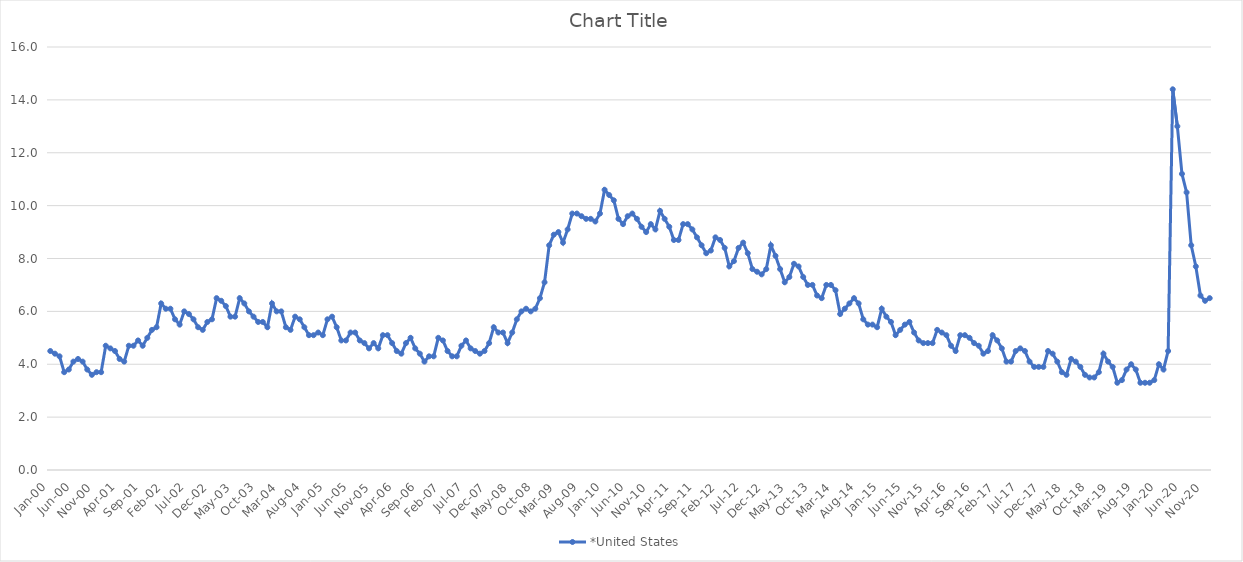
| Category | *United States | Alaska | Alabama | Arkansas | Arizona | California | Colorado | Connecticut | Delaware | Florida | Georgia | Hawaii | Iowa | Idaho | Illinois | Indiana | Kansas | Kentucky | Louisiana | Massachusetts | Maryland | Maine | Michigan | Minnesota | Missouri | Mississippi | Montana | North Carolina | North Dakota | Nebraska | New Hampshire | New Jersey | New Mexico | Nevada | New York | Ohio | Oklahoma | Oregon | Pennsylvania | Rhode Island | South Carolina | South Dakota | Tennessee | Texas | Utah | Virginia | Vermont | Washington | Wisconsin | West Virginia | Wyoming |
|---|---|---|---|---|---|---|---|---|---|---|---|---|---|---|---|---|---|---|---|---|---|---|---|---|---|---|---|---|---|---|---|---|---|---|---|---|---|---|---|---|---|---|---|---|---|---|---|---|---|---|---|
| Jan-00 | 4.5 |  |  |  |  |  |  |  |  |  |  |  |  |  |  |  |  |  |  |  |  |  |  |  |  |  |  |  |  |  |  |  |  |  |  |  |  |  |  |  |  |  |  |  |  |  |  |  |  |  |  |
| Feb-00 | 4.4 |  |  |  |  |  |  |  |  |  |  |  |  |  |  |  |  |  |  |  |  |  |  |  |  |  |  |  |  |  |  |  |  |  |  |  |  |  |  |  |  |  |  |  |  |  |  |  |  |  |  |
| Mar-00 | 4.3 |  |  |  |  |  |  |  |  |  |  |  |  |  |  |  |  |  |  |  |  |  |  |  |  |  |  |  |  |  |  |  |  |  |  |  |  |  |  |  |  |  |  |  |  |  |  |  |  |  |  |
| Apr-00 | 3.7 |  |  |  |  |  |  |  |  |  |  |  |  |  |  |  |  |  |  |  |  |  |  |  |  |  |  |  |  |  |  |  |  |  |  |  |  |  |  |  |  |  |  |  |  |  |  |  |  |  |  |
| May-00 | 3.8 |  |  |  |  |  |  |  |  |  |  |  |  |  |  |  |  |  |  |  |  |  |  |  |  |  |  |  |  |  |  |  |  |  |  |  |  |  |  |  |  |  |  |  |  |  |  |  |  |  |  |
| Jun-00 | 4.1 |  |  |  |  |  |  |  |  |  |  |  |  |  |  |  |  |  |  |  |  |  |  |  |  |  |  |  |  |  |  |  |  |  |  |  |  |  |  |  |  |  |  |  |  |  |  |  |  |  |  |
| Jul-00 | 4.2 |  |  |  |  |  |  |  |  |  |  |  |  |  |  |  |  |  |  |  |  |  |  |  |  |  |  |  |  |  |  |  |  |  |  |  |  |  |  |  |  |  |  |  |  |  |  |  |  |  |  |
| Aug-00 | 4.1 |  |  |  |  |  |  |  |  |  |  |  |  |  |  |  |  |  |  |  |  |  |  |  |  |  |  |  |  |  |  |  |  |  |  |  |  |  |  |  |  |  |  |  |  |  |  |  |  |  |  |
| Sep-00 | 3.8 |  |  |  |  |  |  |  |  |  |  |  |  |  |  |  |  |  |  |  |  |  |  |  |  |  |  |  |  |  |  |  |  |  |  |  |  |  |  |  |  |  |  |  |  |  |  |  |  |  |  |
| Oct-00 | 3.6 |  |  |  |  |  |  |  |  |  |  |  |  |  |  |  |  |  |  |  |  |  |  |  |  |  |  |  |  |  |  |  |  |  |  |  |  |  |  |  |  |  |  |  |  |  |  |  |  |  |  |
| Nov-00 | 3.7 |  |  |  |  |  |  |  |  |  |  |  |  |  |  |  |  |  |  |  |  |  |  |  |  |  |  |  |  |  |  |  |  |  |  |  |  |  |  |  |  |  |  |  |  |  |  |  |  |  |  |
| Dec-00 | 3.7 |  |  |  |  |  |  |  |  |  |  |  |  |  |  |  |  |  |  |  |  |  |  |  |  |  |  |  |  |  |  |  |  |  |  |  |  |  |  |  |  |  |  |  |  |  |  |  |  |  |  |
| Jan-01 | 4.7 |  |  |  |  |  |  |  |  |  |  |  |  |  |  |  |  |  |  |  |  |  |  |  |  |  |  |  |  |  |  |  |  |  |  |  |  |  |  |  |  |  |  |  |  |  |  |  |  |  |  |
| Feb-01 | 4.6 |  |  |  |  |  |  |  |  |  |  |  |  |  |  |  |  |  |  |  |  |  |  |  |  |  |  |  |  |  |  |  |  |  |  |  |  |  |  |  |  |  |  |  |  |  |  |  |  |  |  |
| Mar-01 | 4.5 |  |  |  |  |  |  |  |  |  |  |  |  |  |  |  |  |  |  |  |  |  |  |  |  |  |  |  |  |  |  |  |  |  |  |  |  |  |  |  |  |  |  |  |  |  |  |  |  |  |  |
| Apr-01 | 4.2 |  |  |  |  |  |  |  |  |  |  |  |  |  |  |  |  |  |  |  |  |  |  |  |  |  |  |  |  |  |  |  |  |  |  |  |  |  |  |  |  |  |  |  |  |  |  |  |  |  |  |
| May-01 | 4.1 |  |  |  |  |  |  |  |  |  |  |  |  |  |  |  |  |  |  |  |  |  |  |  |  |  |  |  |  |  |  |  |  |  |  |  |  |  |  |  |  |  |  |  |  |  |  |  |  |  |  |
| Jun-01 | 4.7 |  |  |  |  |  |  |  |  |  |  |  |  |  |  |  |  |  |  |  |  |  |  |  |  |  |  |  |  |  |  |  |  |  |  |  |  |  |  |  |  |  |  |  |  |  |  |  |  |  |  |
| Jul-01 | 4.7 |  |  |  |  |  |  |  |  |  |  |  |  |  |  |  |  |  |  |  |  |  |  |  |  |  |  |  |  |  |  |  |  |  |  |  |  |  |  |  |  |  |  |  |  |  |  |  |  |  |  |
| Aug-01 | 4.9 |  |  |  |  |  |  |  |  |  |  |  |  |  |  |  |  |  |  |  |  |  |  |  |  |  |  |  |  |  |  |  |  |  |  |  |  |  |  |  |  |  |  |  |  |  |  |  |  |  |  |
| Sep-01 | 4.7 |  |  |  |  |  |  |  |  |  |  |  |  |  |  |  |  |  |  |  |  |  |  |  |  |  |  |  |  |  |  |  |  |  |  |  |  |  |  |  |  |  |  |  |  |  |  |  |  |  |  |
| Oct-01 | 5 |  |  |  |  |  |  |  |  |  |  |  |  |  |  |  |  |  |  |  |  |  |  |  |  |  |  |  |  |  |  |  |  |  |  |  |  |  |  |  |  |  |  |  |  |  |  |  |  |  |  |
| Nov-01 | 5.3 |  |  |  |  |  |  |  |  |  |  |  |  |  |  |  |  |  |  |  |  |  |  |  |  |  |  |  |  |  |  |  |  |  |  |  |  |  |  |  |  |  |  |  |  |  |  |  |  |  |  |
| Dec-01 | 5.4 |  |  |  |  |  |  |  |  |  |  |  |  |  |  |  |  |  |  |  |  |  |  |  |  |  |  |  |  |  |  |  |  |  |  |  |  |  |  |  |  |  |  |  |  |  |  |  |  |  |  |
| Jan-02 | 6.3 |  |  |  |  |  |  |  |  |  |  |  |  |  |  |  |  |  |  |  |  |  |  |  |  |  |  |  |  |  |  |  |  |  |  |  |  |  |  |  |  |  |  |  |  |  |  |  |  |  |  |
| Feb-02 | 6.1 |  |  |  |  |  |  |  |  |  |  |  |  |  |  |  |  |  |  |  |  |  |  |  |  |  |  |  |  |  |  |  |  |  |  |  |  |  |  |  |  |  |  |  |  |  |  |  |  |  |  |
| Mar-02 | 6.1 |  |  |  |  |  |  |  |  |  |  |  |  |  |  |  |  |  |  |  |  |  |  |  |  |  |  |  |  |  |  |  |  |  |  |  |  |  |  |  |  |  |  |  |  |  |  |  |  |  |  |
| Apr-02 | 5.7 |  |  |  |  |  |  |  |  |  |  |  |  |  |  |  |  |  |  |  |  |  |  |  |  |  |  |  |  |  |  |  |  |  |  |  |  |  |  |  |  |  |  |  |  |  |  |  |  |  |  |
| May-02 | 5.5 |  |  |  |  |  |  |  |  |  |  |  |  |  |  |  |  |  |  |  |  |  |  |  |  |  |  |  |  |  |  |  |  |  |  |  |  |  |  |  |  |  |  |  |  |  |  |  |  |  |  |
| Jun-02 | 6 |  |  |  |  |  |  |  |  |  |  |  |  |  |  |  |  |  |  |  |  |  |  |  |  |  |  |  |  |  |  |  |  |  |  |  |  |  |  |  |  |  |  |  |  |  |  |  |  |  |  |
| Jul-02 | 5.9 |  |  |  |  |  |  |  |  |  |  |  |  |  |  |  |  |  |  |  |  |  |  |  |  |  |  |  |  |  |  |  |  |  |  |  |  |  |  |  |  |  |  |  |  |  |  |  |  |  |  |
| Aug-02 | 5.7 |  |  |  |  |  |  |  |  |  |  |  |  |  |  |  |  |  |  |  |  |  |  |  |  |  |  |  |  |  |  |  |  |  |  |  |  |  |  |  |  |  |  |  |  |  |  |  |  |  |  |
| Sep-02 | 5.4 |  |  |  |  |  |  |  |  |  |  |  |  |  |  |  |  |  |  |  |  |  |  |  |  |  |  |  |  |  |  |  |  |  |  |  |  |  |  |  |  |  |  |  |  |  |  |  |  |  |  |
| Oct-02 | 5.3 |  |  |  |  |  |  |  |  |  |  |  |  |  |  |  |  |  |  |  |  |  |  |  |  |  |  |  |  |  |  |  |  |  |  |  |  |  |  |  |  |  |  |  |  |  |  |  |  |  |  |
| Nov-02 | 5.6 |  |  |  |  |  |  |  |  |  |  |  |  |  |  |  |  |  |  |  |  |  |  |  |  |  |  |  |  |  |  |  |  |  |  |  |  |  |  |  |  |  |  |  |  |  |  |  |  |  |  |
| Dec-02 | 5.7 |  |  |  |  |  |  |  |  |  |  |  |  |  |  |  |  |  |  |  |  |  |  |  |  |  |  |  |  |  |  |  |  |  |  |  |  |  |  |  |  |  |  |  |  |  |  |  |  |  |  |
| Jan-03 | 6.5 |  |  |  |  |  |  |  |  |  |  |  |  |  |  |  |  |  |  |  |  |  |  |  |  |  |  |  |  |  |  |  |  |  |  |  |  |  |  |  |  |  |  |  |  |  |  |  |  |  |  |
| Feb-03 | 6.4 |  |  |  |  |  |  |  |  |  |  |  |  |  |  |  |  |  |  |  |  |  |  |  |  |  |  |  |  |  |  |  |  |  |  |  |  |  |  |  |  |  |  |  |  |  |  |  |  |  |  |
| Mar-03 | 6.2 |  |  |  |  |  |  |  |  |  |  |  |  |  |  |  |  |  |  |  |  |  |  |  |  |  |  |  |  |  |  |  |  |  |  |  |  |  |  |  |  |  |  |  |  |  |  |  |  |  |  |
| Apr-03 | 5.8 |  |  |  |  |  |  |  |  |  |  |  |  |  |  |  |  |  |  |  |  |  |  |  |  |  |  |  |  |  |  |  |  |  |  |  |  |  |  |  |  |  |  |  |  |  |  |  |  |  |  |
| May-03 | 5.8 |  |  |  |  |  |  |  |  |  |  |  |  |  |  |  |  |  |  |  |  |  |  |  |  |  |  |  |  |  |  |  |  |  |  |  |  |  |  |  |  |  |  |  |  |  |  |  |  |  |  |
| Jun-03 | 6.5 |  |  |  |  |  |  |  |  |  |  |  |  |  |  |  |  |  |  |  |  |  |  |  |  |  |  |  |  |  |  |  |  |  |  |  |  |  |  |  |  |  |  |  |  |  |  |  |  |  |  |
| Jul-03 | 6.3 |  |  |  |  |  |  |  |  |  |  |  |  |  |  |  |  |  |  |  |  |  |  |  |  |  |  |  |  |  |  |  |  |  |  |  |  |  |  |  |  |  |  |  |  |  |  |  |  |  |  |
| Aug-03 | 6 |  |  |  |  |  |  |  |  |  |  |  |  |  |  |  |  |  |  |  |  |  |  |  |  |  |  |  |  |  |  |  |  |  |  |  |  |  |  |  |  |  |  |  |  |  |  |  |  |  |  |
| Sep-03 | 5.8 |  |  |  |  |  |  |  |  |  |  |  |  |  |  |  |  |  |  |  |  |  |  |  |  |  |  |  |  |  |  |  |  |  |  |  |  |  |  |  |  |  |  |  |  |  |  |  |  |  |  |
| Oct-03 | 5.6 |  |  |  |  |  |  |  |  |  |  |  |  |  |  |  |  |  |  |  |  |  |  |  |  |  |  |  |  |  |  |  |  |  |  |  |  |  |  |  |  |  |  |  |  |  |  |  |  |  |  |
| Nov-03 | 5.6 |  |  |  |  |  |  |  |  |  |  |  |  |  |  |  |  |  |  |  |  |  |  |  |  |  |  |  |  |  |  |  |  |  |  |  |  |  |  |  |  |  |  |  |  |  |  |  |  |  |  |
| Dec-03 | 5.4 |  |  |  |  |  |  |  |  |  |  |  |  |  |  |  |  |  |  |  |  |  |  |  |  |  |  |  |  |  |  |  |  |  |  |  |  |  |  |  |  |  |  |  |  |  |  |  |  |  |  |
| Jan-04 | 6.3 |  |  |  |  |  |  |  |  |  |  |  |  |  |  |  |  |  |  |  |  |  |  |  |  |  |  |  |  |  |  |  |  |  |  |  |  |  |  |  |  |  |  |  |  |  |  |  |  |  |  |
| Feb-04 | 6 |  |  |  |  |  |  |  |  |  |  |  |  |  |  |  |  |  |  |  |  |  |  |  |  |  |  |  |  |  |  |  |  |  |  |  |  |  |  |  |  |  |  |  |  |  |  |  |  |  |  |
| Mar-04 | 6 |  |  |  |  |  |  |  |  |  |  |  |  |  |  |  |  |  |  |  |  |  |  |  |  |  |  |  |  |  |  |  |  |  |  |  |  |  |  |  |  |  |  |  |  |  |  |  |  |  |  |
| Apr-04 | 5.4 |  |  |  |  |  |  |  |  |  |  |  |  |  |  |  |  |  |  |  |  |  |  |  |  |  |  |  |  |  |  |  |  |  |  |  |  |  |  |  |  |  |  |  |  |  |  |  |  |  |  |
| May-04 | 5.3 |  |  |  |  |  |  |  |  |  |  |  |  |  |  |  |  |  |  |  |  |  |  |  |  |  |  |  |  |  |  |  |  |  |  |  |  |  |  |  |  |  |  |  |  |  |  |  |  |  |  |
| Jun-04 | 5.8 |  |  |  |  |  |  |  |  |  |  |  |  |  |  |  |  |  |  |  |  |  |  |  |  |  |  |  |  |  |  |  |  |  |  |  |  |  |  |  |  |  |  |  |  |  |  |  |  |  |  |
| Jul-04 | 5.7 |  |  |  |  |  |  |  |  |  |  |  |  |  |  |  |  |  |  |  |  |  |  |  |  |  |  |  |  |  |  |  |  |  |  |  |  |  |  |  |  |  |  |  |  |  |  |  |  |  |  |
| Aug-04 | 5.4 |  |  |  |  |  |  |  |  |  |  |  |  |  |  |  |  |  |  |  |  |  |  |  |  |  |  |  |  |  |  |  |  |  |  |  |  |  |  |  |  |  |  |  |  |  |  |  |  |  |  |
| Sep-04 | 5.1 |  |  |  |  |  |  |  |  |  |  |  |  |  |  |  |  |  |  |  |  |  |  |  |  |  |  |  |  |  |  |  |  |  |  |  |  |  |  |  |  |  |  |  |  |  |  |  |  |  |  |
| Oct-04 | 5.1 |  |  |  |  |  |  |  |  |  |  |  |  |  |  |  |  |  |  |  |  |  |  |  |  |  |  |  |  |  |  |  |  |  |  |  |  |  |  |  |  |  |  |  |  |  |  |  |  |  |  |
| Nov-04 | 5.2 |  |  |  |  |  |  |  |  |  |  |  |  |  |  |  |  |  |  |  |  |  |  |  |  |  |  |  |  |  |  |  |  |  |  |  |  |  |  |  |  |  |  |  |  |  |  |  |  |  |  |
| Dec-04 | 5.1 |  |  |  |  |  |  |  |  |  |  |  |  |  |  |  |  |  |  |  |  |  |  |  |  |  |  |  |  |  |  |  |  |  |  |  |  |  |  |  |  |  |  |  |  |  |  |  |  |  |  |
| Jan-05 | 5.7 |  |  |  |  |  |  |  |  |  |  |  |  |  |  |  |  |  |  |  |  |  |  |  |  |  |  |  |  |  |  |  |  |  |  |  |  |  |  |  |  |  |  |  |  |  |  |  |  |  |  |
| Feb-05 | 5.8 |  |  |  |  |  |  |  |  |  |  |  |  |  |  |  |  |  |  |  |  |  |  |  |  |  |  |  |  |  |  |  |  |  |  |  |  |  |  |  |  |  |  |  |  |  |  |  |  |  |  |
| Mar-05 | 5.4 |  |  |  |  |  |  |  |  |  |  |  |  |  |  |  |  |  |  |  |  |  |  |  |  |  |  |  |  |  |  |  |  |  |  |  |  |  |  |  |  |  |  |  |  |  |  |  |  |  |  |
| Apr-05 | 4.9 |  |  |  |  |  |  |  |  |  |  |  |  |  |  |  |  |  |  |  |  |  |  |  |  |  |  |  |  |  |  |  |  |  |  |  |  |  |  |  |  |  |  |  |  |  |  |  |  |  |  |
| May-05 | 4.9 |  |  |  |  |  |  |  |  |  |  |  |  |  |  |  |  |  |  |  |  |  |  |  |  |  |  |  |  |  |  |  |  |  |  |  |  |  |  |  |  |  |  |  |  |  |  |  |  |  |  |
| Jun-05 | 5.2 |  |  |  |  |  |  |  |  |  |  |  |  |  |  |  |  |  |  |  |  |  |  |  |  |  |  |  |  |  |  |  |  |  |  |  |  |  |  |  |  |  |  |  |  |  |  |  |  |  |  |
| Jul-05 | 5.2 |  |  |  |  |  |  |  |  |  |  |  |  |  |  |  |  |  |  |  |  |  |  |  |  |  |  |  |  |  |  |  |  |  |  |  |  |  |  |  |  |  |  |  |  |  |  |  |  |  |  |
| Aug-05 | 4.9 |  |  |  |  |  |  |  |  |  |  |  |  |  |  |  |  |  |  |  |  |  |  |  |  |  |  |  |  |  |  |  |  |  |  |  |  |  |  |  |  |  |  |  |  |  |  |  |  |  |  |
| Sep-05 | 4.8 |  |  |  |  |  |  |  |  |  |  |  |  |  |  |  |  |  |  |  |  |  |  |  |  |  |  |  |  |  |  |  |  |  |  |  |  |  |  |  |  |  |  |  |  |  |  |  |  |  |  |
| Oct-05 | 4.6 |  |  |  |  |  |  |  |  |  |  |  |  |  |  |  |  |  |  |  |  |  |  |  |  |  |  |  |  |  |  |  |  |  |  |  |  |  |  |  |  |  |  |  |  |  |  |  |  |  |  |
| Nov-05 | 4.8 |  |  |  |  |  |  |  |  |  |  |  |  |  |  |  |  |  |  |  |  |  |  |  |  |  |  |  |  |  |  |  |  |  |  |  |  |  |  |  |  |  |  |  |  |  |  |  |  |  |  |
| Dec-05 | 4.6 |  |  |  |  |  |  |  |  |  |  |  |  |  |  |  |  |  |  |  |  |  |  |  |  |  |  |  |  |  |  |  |  |  |  |  |  |  |  |  |  |  |  |  |  |  |  |  |  |  |  |
| Jan-06 | 5.1 |  |  |  |  |  |  |  |  |  |  |  |  |  |  |  |  |  |  |  |  |  |  |  |  |  |  |  |  |  |  |  |  |  |  |  |  |  |  |  |  |  |  |  |  |  |  |  |  |  |  |
| Feb-06 | 5.1 |  |  |  |  |  |  |  |  |  |  |  |  |  |  |  |  |  |  |  |  |  |  |  |  |  |  |  |  |  |  |  |  |  |  |  |  |  |  |  |  |  |  |  |  |  |  |  |  |  |  |
| Mar-06 | 4.8 |  |  |  |  |  |  |  |  |  |  |  |  |  |  |  |  |  |  |  |  |  |  |  |  |  |  |  |  |  |  |  |  |  |  |  |  |  |  |  |  |  |  |  |  |  |  |  |  |  |  |
| Apr-06 | 4.5 |  |  |  |  |  |  |  |  |  |  |  |  |  |  |  |  |  |  |  |  |  |  |  |  |  |  |  |  |  |  |  |  |  |  |  |  |  |  |  |  |  |  |  |  |  |  |  |  |  |  |
| May-06 | 4.4 |  |  |  |  |  |  |  |  |  |  |  |  |  |  |  |  |  |  |  |  |  |  |  |  |  |  |  |  |  |  |  |  |  |  |  |  |  |  |  |  |  |  |  |  |  |  |  |  |  |  |
| Jun-06 | 4.8 |  |  |  |  |  |  |  |  |  |  |  |  |  |  |  |  |  |  |  |  |  |  |  |  |  |  |  |  |  |  |  |  |  |  |  |  |  |  |  |  |  |  |  |  |  |  |  |  |  |  |
| Jul-06 | 5 |  |  |  |  |  |  |  |  |  |  |  |  |  |  |  |  |  |  |  |  |  |  |  |  |  |  |  |  |  |  |  |  |  |  |  |  |  |  |  |  |  |  |  |  |  |  |  |  |  |  |
| Aug-06 | 4.6 |  |  |  |  |  |  |  |  |  |  |  |  |  |  |  |  |  |  |  |  |  |  |  |  |  |  |  |  |  |  |  |  |  |  |  |  |  |  |  |  |  |  |  |  |  |  |  |  |  |  |
| Sep-06 | 4.4 |  |  |  |  |  |  |  |  |  |  |  |  |  |  |  |  |  |  |  |  |  |  |  |  |  |  |  |  |  |  |  |  |  |  |  |  |  |  |  |  |  |  |  |  |  |  |  |  |  |  |
| Oct-06 | 4.1 |  |  |  |  |  |  |  |  |  |  |  |  |  |  |  |  |  |  |  |  |  |  |  |  |  |  |  |  |  |  |  |  |  |  |  |  |  |  |  |  |  |  |  |  |  |  |  |  |  |  |
| Nov-06 | 4.3 |  |  |  |  |  |  |  |  |  |  |  |  |  |  |  |  |  |  |  |  |  |  |  |  |  |  |  |  |  |  |  |  |  |  |  |  |  |  |  |  |  |  |  |  |  |  |  |  |  |  |
| Dec-06 | 4.3 |  |  |  |  |  |  |  |  |  |  |  |  |  |  |  |  |  |  |  |  |  |  |  |  |  |  |  |  |  |  |  |  |  |  |  |  |  |  |  |  |  |  |  |  |  |  |  |  |  |  |
| Jan-07 | 5 |  |  |  |  |  |  |  |  |  |  |  |  |  |  |  |  |  |  |  |  |  |  |  |  |  |  |  |  |  |  |  |  |  |  |  |  |  |  |  |  |  |  |  |  |  |  |  |  |  |  |
| Feb-07 | 4.9 |  |  |  |  |  |  |  |  |  |  |  |  |  |  |  |  |  |  |  |  |  |  |  |  |  |  |  |  |  |  |  |  |  |  |  |  |  |  |  |  |  |  |  |  |  |  |  |  |  |  |
| Mar-07 | 4.5 |  |  |  |  |  |  |  |  |  |  |  |  |  |  |  |  |  |  |  |  |  |  |  |  |  |  |  |  |  |  |  |  |  |  |  |  |  |  |  |  |  |  |  |  |  |  |  |  |  |  |
| Apr-07 | 4.3 |  |  |  |  |  |  |  |  |  |  |  |  |  |  |  |  |  |  |  |  |  |  |  |  |  |  |  |  |  |  |  |  |  |  |  |  |  |  |  |  |  |  |  |  |  |  |  |  |  |  |
| May-07 | 4.3 |  |  |  |  |  |  |  |  |  |  |  |  |  |  |  |  |  |  |  |  |  |  |  |  |  |  |  |  |  |  |  |  |  |  |  |  |  |  |  |  |  |  |  |  |  |  |  |  |  |  |
| Jun-07 | 4.7 |  |  |  |  |  |  |  |  |  |  |  |  |  |  |  |  |  |  |  |  |  |  |  |  |  |  |  |  |  |  |  |  |  |  |  |  |  |  |  |  |  |  |  |  |  |  |  |  |  |  |
| Jul-07 | 4.9 |  |  |  |  |  |  |  |  |  |  |  |  |  |  |  |  |  |  |  |  |  |  |  |  |  |  |  |  |  |  |  |  |  |  |  |  |  |  |  |  |  |  |  |  |  |  |  |  |  |  |
| Aug-07 | 4.6 |  |  |  |  |  |  |  |  |  |  |  |  |  |  |  |  |  |  |  |  |  |  |  |  |  |  |  |  |  |  |  |  |  |  |  |  |  |  |  |  |  |  |  |  |  |  |  |  |  |  |
| Sep-07 | 4.5 |  |  |  |  |  |  |  |  |  |  |  |  |  |  |  |  |  |  |  |  |  |  |  |  |  |  |  |  |  |  |  |  |  |  |  |  |  |  |  |  |  |  |  |  |  |  |  |  |  |  |
| Oct-07 | 4.4 |  |  |  |  |  |  |  |  |  |  |  |  |  |  |  |  |  |  |  |  |  |  |  |  |  |  |  |  |  |  |  |  |  |  |  |  |  |  |  |  |  |  |  |  |  |  |  |  |  |  |
| Nov-07 | 4.5 |  |  |  |  |  |  |  |  |  |  |  |  |  |  |  |  |  |  |  |  |  |  |  |  |  |  |  |  |  |  |  |  |  |  |  |  |  |  |  |  |  |  |  |  |  |  |  |  |  |  |
| Dec-07 | 4.8 |  |  |  |  |  |  |  |  |  |  |  |  |  |  |  |  |  |  |  |  |  |  |  |  |  |  |  |  |  |  |  |  |  |  |  |  |  |  |  |  |  |  |  |  |  |  |  |  |  |  |
| Jan-08 | 5.4 |  |  |  |  |  |  |  |  |  |  |  |  |  |  |  |  |  |  |  |  |  |  |  |  |  |  |  |  |  |  |  |  |  |  |  |  |  |  |  |  |  |  |  |  |  |  |  |  |  |  |
| Feb-08 | 5.2 |  |  |  |  |  |  |  |  |  |  |  |  |  |  |  |  |  |  |  |  |  |  |  |  |  |  |  |  |  |  |  |  |  |  |  |  |  |  |  |  |  |  |  |  |  |  |  |  |  |  |
| Mar-08 | 5.2 |  |  |  |  |  |  |  |  |  |  |  |  |  |  |  |  |  |  |  |  |  |  |  |  |  |  |  |  |  |  |  |  |  |  |  |  |  |  |  |  |  |  |  |  |  |  |  |  |  |  |
| Apr-08 | 4.8 |  |  |  |  |  |  |  |  |  |  |  |  |  |  |  |  |  |  |  |  |  |  |  |  |  |  |  |  |  |  |  |  |  |  |  |  |  |  |  |  |  |  |  |  |  |  |  |  |  |  |
| May-08 | 5.2 |  |  |  |  |  |  |  |  |  |  |  |  |  |  |  |  |  |  |  |  |  |  |  |  |  |  |  |  |  |  |  |  |  |  |  |  |  |  |  |  |  |  |  |  |  |  |  |  |  |  |
| Jun-08 | 5.7 |  |  |  |  |  |  |  |  |  |  |  |  |  |  |  |  |  |  |  |  |  |  |  |  |  |  |  |  |  |  |  |  |  |  |  |  |  |  |  |  |  |  |  |  |  |  |  |  |  |  |
| Jul-08 | 6 |  |  |  |  |  |  |  |  |  |  |  |  |  |  |  |  |  |  |  |  |  |  |  |  |  |  |  |  |  |  |  |  |  |  |  |  |  |  |  |  |  |  |  |  |  |  |  |  |  |  |
| Aug-08 | 6.1 |  |  |  |  |  |  |  |  |  |  |  |  |  |  |  |  |  |  |  |  |  |  |  |  |  |  |  |  |  |  |  |  |  |  |  |  |  |  |  |  |  |  |  |  |  |  |  |  |  |  |
| Sep-08 | 6 |  |  |  |  |  |  |  |  |  |  |  |  |  |  |  |  |  |  |  |  |  |  |  |  |  |  |  |  |  |  |  |  |  |  |  |  |  |  |  |  |  |  |  |  |  |  |  |  |  |  |
| Oct-08 | 6.1 |  |  |  |  |  |  |  |  |  |  |  |  |  |  |  |  |  |  |  |  |  |  |  |  |  |  |  |  |  |  |  |  |  |  |  |  |  |  |  |  |  |  |  |  |  |  |  |  |  |  |
| Nov-08 | 6.5 |  |  |  |  |  |  |  |  |  |  |  |  |  |  |  |  |  |  |  |  |  |  |  |  |  |  |  |  |  |  |  |  |  |  |  |  |  |  |  |  |  |  |  |  |  |  |  |  |  |  |
| Dec-08 | 7.1 |  |  |  |  |  |  |  |  |  |  |  |  |  |  |  |  |  |  |  |  |  |  |  |  |  |  |  |  |  |  |  |  |  |  |  |  |  |  |  |  |  |  |  |  |  |  |  |  |  |  |
| Jan-09 | 8.5 |  |  |  |  |  |  |  |  |  |  |  |  |  |  |  |  |  |  |  |  |  |  |  |  |  |  |  |  |  |  |  |  |  |  |  |  |  |  |  |  |  |  |  |  |  |  |  |  |  |  |
| Feb-09 | 8.9 |  |  |  |  |  |  |  |  |  |  |  |  |  |  |  |  |  |  |  |  |  |  |  |  |  |  |  |  |  |  |  |  |  |  |  |  |  |  |  |  |  |  |  |  |  |  |  |  |  |  |
| Mar-09 | 9 |  |  |  |  |  |  |  |  |  |  |  |  |  |  |  |  |  |  |  |  |  |  |  |  |  |  |  |  |  |  |  |  |  |  |  |  |  |  |  |  |  |  |  |  |  |  |  |  |  |  |
| Apr-09 | 8.6 |  |  |  |  |  |  |  |  |  |  |  |  |  |  |  |  |  |  |  |  |  |  |  |  |  |  |  |  |  |  |  |  |  |  |  |  |  |  |  |  |  |  |  |  |  |  |  |  |  |  |
| May-09 | 9.1 |  |  |  |  |  |  |  |  |  |  |  |  |  |  |  |  |  |  |  |  |  |  |  |  |  |  |  |  |  |  |  |  |  |  |  |  |  |  |  |  |  |  |  |  |  |  |  |  |  |  |
| Jun-09 | 9.7 |  |  |  |  |  |  |  |  |  |  |  |  |  |  |  |  |  |  |  |  |  |  |  |  |  |  |  |  |  |  |  |  |  |  |  |  |  |  |  |  |  |  |  |  |  |  |  |  |  |  |
| Jul-09 | 9.7 |  |  |  |  |  |  |  |  |  |  |  |  |  |  |  |  |  |  |  |  |  |  |  |  |  |  |  |  |  |  |  |  |  |  |  |  |  |  |  |  |  |  |  |  |  |  |  |  |  |  |
| Aug-09 | 9.6 |  |  |  |  |  |  |  |  |  |  |  |  |  |  |  |  |  |  |  |  |  |  |  |  |  |  |  |  |  |  |  |  |  |  |  |  |  |  |  |  |  |  |  |  |  |  |  |  |  |  |
| Sep-09 | 9.5 |  |  |  |  |  |  |  |  |  |  |  |  |  |  |  |  |  |  |  |  |  |  |  |  |  |  |  |  |  |  |  |  |  |  |  |  |  |  |  |  |  |  |  |  |  |  |  |  |  |  |
| Oct-09 | 9.5 |  |  |  |  |  |  |  |  |  |  |  |  |  |  |  |  |  |  |  |  |  |  |  |  |  |  |  |  |  |  |  |  |  |  |  |  |  |  |  |  |  |  |  |  |  |  |  |  |  |  |
| Nov-09 | 9.4 |  |  |  |  |  |  |  |  |  |  |  |  |  |  |  |  |  |  |  |  |  |  |  |  |  |  |  |  |  |  |  |  |  |  |  |  |  |  |  |  |  |  |  |  |  |  |  |  |  |  |
| Dec-09 | 9.7 |  |  |  |  |  |  |  |  |  |  |  |  |  |  |  |  |  |  |  |  |  |  |  |  |  |  |  |  |  |  |  |  |  |  |  |  |  |  |  |  |  |  |  |  |  |  |  |  |  |  |
| Jan-10 | 10.6 |  |  |  |  |  |  |  |  |  |  |  |  |  |  |  |  |  |  |  |  |  |  |  |  |  |  |  |  |  |  |  |  |  |  |  |  |  |  |  |  |  |  |  |  |  |  |  |  |  |  |
| Feb-10 | 10.4 |  |  |  |  |  |  |  |  |  |  |  |  |  |  |  |  |  |  |  |  |  |  |  |  |  |  |  |  |  |  |  |  |  |  |  |  |  |  |  |  |  |  |  |  |  |  |  |  |  |  |
| Mar-10 | 10.2 |  |  |  |  |  |  |  |  |  |  |  |  |  |  |  |  |  |  |  |  |  |  |  |  |  |  |  |  |  |  |  |  |  |  |  |  |  |  |  |  |  |  |  |  |  |  |  |  |  |  |
| Apr-10 | 9.5 |  |  |  |  |  |  |  |  |  |  |  |  |  |  |  |  |  |  |  |  |  |  |  |  |  |  |  |  |  |  |  |  |  |  |  |  |  |  |  |  |  |  |  |  |  |  |  |  |  |  |
| May-10 | 9.3 |  |  |  |  |  |  |  |  |  |  |  |  |  |  |  |  |  |  |  |  |  |  |  |  |  |  |  |  |  |  |  |  |  |  |  |  |  |  |  |  |  |  |  |  |  |  |  |  |  |  |
| Jun-10 | 9.6 |  |  |  |  |  |  |  |  |  |  |  |  |  |  |  |  |  |  |  |  |  |  |  |  |  |  |  |  |  |  |  |  |  |  |  |  |  |  |  |  |  |  |  |  |  |  |  |  |  |  |
| Jul-10 | 9.7 |  |  |  |  |  |  |  |  |  |  |  |  |  |  |  |  |  |  |  |  |  |  |  |  |  |  |  |  |  |  |  |  |  |  |  |  |  |  |  |  |  |  |  |  |  |  |  |  |  |  |
| Aug-10 | 9.5 |  |  |  |  |  |  |  |  |  |  |  |  |  |  |  |  |  |  |  |  |  |  |  |  |  |  |  |  |  |  |  |  |  |  |  |  |  |  |  |  |  |  |  |  |  |  |  |  |  |  |
| Sep-10 | 9.2 |  |  |  |  |  |  |  |  |  |  |  |  |  |  |  |  |  |  |  |  |  |  |  |  |  |  |  |  |  |  |  |  |  |  |  |  |  |  |  |  |  |  |  |  |  |  |  |  |  |  |
| Oct-10 | 9 |  |  |  |  |  |  |  |  |  |  |  |  |  |  |  |  |  |  |  |  |  |  |  |  |  |  |  |  |  |  |  |  |  |  |  |  |  |  |  |  |  |  |  |  |  |  |  |  |  |  |
| Nov-10 | 9.3 |  |  |  |  |  |  |  |  |  |  |  |  |  |  |  |  |  |  |  |  |  |  |  |  |  |  |  |  |  |  |  |  |  |  |  |  |  |  |  |  |  |  |  |  |  |  |  |  |  |  |
| Dec-10 | 9.1 |  |  |  |  |  |  |  |  |  |  |  |  |  |  |  |  |  |  |  |  |  |  |  |  |  |  |  |  |  |  |  |  |  |  |  |  |  |  |  |  |  |  |  |  |  |  |  |  |  |  |
| Jan-11 | 9.8 |  |  |  |  |  |  |  |  |  |  |  |  |  |  |  |  |  |  |  |  |  |  |  |  |  |  |  |  |  |  |  |  |  |  |  |  |  |  |  |  |  |  |  |  |  |  |  |  |  |  |
| Feb-11 | 9.5 |  |  |  |  |  |  |  |  |  |  |  |  |  |  |  |  |  |  |  |  |  |  |  |  |  |  |  |  |  |  |  |  |  |  |  |  |  |  |  |  |  |  |  |  |  |  |  |  |  |  |
| Mar-11 | 9.2 |  |  |  |  |  |  |  |  |  |  |  |  |  |  |  |  |  |  |  |  |  |  |  |  |  |  |  |  |  |  |  |  |  |  |  |  |  |  |  |  |  |  |  |  |  |  |  |  |  |  |
| Apr-11 | 8.7 |  |  |  |  |  |  |  |  |  |  |  |  |  |  |  |  |  |  |  |  |  |  |  |  |  |  |  |  |  |  |  |  |  |  |  |  |  |  |  |  |  |  |  |  |  |  |  |  |  |  |
| May-11 | 8.7 |  |  |  |  |  |  |  |  |  |  |  |  |  |  |  |  |  |  |  |  |  |  |  |  |  |  |  |  |  |  |  |  |  |  |  |  |  |  |  |  |  |  |  |  |  |  |  |  |  |  |
| Jun-11 | 9.3 |  |  |  |  |  |  |  |  |  |  |  |  |  |  |  |  |  |  |  |  |  |  |  |  |  |  |  |  |  |  |  |  |  |  |  |  |  |  |  |  |  |  |  |  |  |  |  |  |  |  |
| Jul-11 | 9.3 |  |  |  |  |  |  |  |  |  |  |  |  |  |  |  |  |  |  |  |  |  |  |  |  |  |  |  |  |  |  |  |  |  |  |  |  |  |  |  |  |  |  |  |  |  |  |  |  |  |  |
| Aug-11 | 9.1 |  |  |  |  |  |  |  |  |  |  |  |  |  |  |  |  |  |  |  |  |  |  |  |  |  |  |  |  |  |  |  |  |  |  |  |  |  |  |  |  |  |  |  |  |  |  |  |  |  |  |
| Sep-11 | 8.8 |  |  |  |  |  |  |  |  |  |  |  |  |  |  |  |  |  |  |  |  |  |  |  |  |  |  |  |  |  |  |  |  |  |  |  |  |  |  |  |  |  |  |  |  |  |  |  |  |  |  |
| Oct-11 | 8.5 |  |  |  |  |  |  |  |  |  |  |  |  |  |  |  |  |  |  |  |  |  |  |  |  |  |  |  |  |  |  |  |  |  |  |  |  |  |  |  |  |  |  |  |  |  |  |  |  |  |  |
| Nov-11 | 8.2 |  |  |  |  |  |  |  |  |  |  |  |  |  |  |  |  |  |  |  |  |  |  |  |  |  |  |  |  |  |  |  |  |  |  |  |  |  |  |  |  |  |  |  |  |  |  |  |  |  |  |
| Dec-11 | 8.3 |  |  |  |  |  |  |  |  |  |  |  |  |  |  |  |  |  |  |  |  |  |  |  |  |  |  |  |  |  |  |  |  |  |  |  |  |  |  |  |  |  |  |  |  |  |  |  |  |  |  |
| Jan-12 | 8.8 |  |  |  |  |  |  |  |  |  |  |  |  |  |  |  |  |  |  |  |  |  |  |  |  |  |  |  |  |  |  |  |  |  |  |  |  |  |  |  |  |  |  |  |  |  |  |  |  |  |  |
| Feb-12 | 8.7 |  |  |  |  |  |  |  |  |  |  |  |  |  |  |  |  |  |  |  |  |  |  |  |  |  |  |  |  |  |  |  |  |  |  |  |  |  |  |  |  |  |  |  |  |  |  |  |  |  |  |
| Mar-12 | 8.4 |  |  |  |  |  |  |  |  |  |  |  |  |  |  |  |  |  |  |  |  |  |  |  |  |  |  |  |  |  |  |  |  |  |  |  |  |  |  |  |  |  |  |  |  |  |  |  |  |  |  |
| Apr-12 | 7.7 |  |  |  |  |  |  |  |  |  |  |  |  |  |  |  |  |  |  |  |  |  |  |  |  |  |  |  |  |  |  |  |  |  |  |  |  |  |  |  |  |  |  |  |  |  |  |  |  |  |  |
| May-12 | 7.9 |  |  |  |  |  |  |  |  |  |  |  |  |  |  |  |  |  |  |  |  |  |  |  |  |  |  |  |  |  |  |  |  |  |  |  |  |  |  |  |  |  |  |  |  |  |  |  |  |  |  |
| Jun-12 | 8.4 |  |  |  |  |  |  |  |  |  |  |  |  |  |  |  |  |  |  |  |  |  |  |  |  |  |  |  |  |  |  |  |  |  |  |  |  |  |  |  |  |  |  |  |  |  |  |  |  |  |  |
| Jul-12 | 8.6 |  |  |  |  |  |  |  |  |  |  |  |  |  |  |  |  |  |  |  |  |  |  |  |  |  |  |  |  |  |  |  |  |  |  |  |  |  |  |  |  |  |  |  |  |  |  |  |  |  |  |
| Aug-12 | 8.2 |  |  |  |  |  |  |  |  |  |  |  |  |  |  |  |  |  |  |  |  |  |  |  |  |  |  |  |  |  |  |  |  |  |  |  |  |  |  |  |  |  |  |  |  |  |  |  |  |  |  |
| Sep-12 | 7.6 |  |  |  |  |  |  |  |  |  |  |  |  |  |  |  |  |  |  |  |  |  |  |  |  |  |  |  |  |  |  |  |  |  |  |  |  |  |  |  |  |  |  |  |  |  |  |  |  |  |  |
| Oct-12 | 7.5 |  |  |  |  |  |  |  |  |  |  |  |  |  |  |  |  |  |  |  |  |  |  |  |  |  |  |  |  |  |  |  |  |  |  |  |  |  |  |  |  |  |  |  |  |  |  |  |  |  |  |
| Nov-12 | 7.4 |  |  |  |  |  |  |  |  |  |  |  |  |  |  |  |  |  |  |  |  |  |  |  |  |  |  |  |  |  |  |  |  |  |  |  |  |  |  |  |  |  |  |  |  |  |  |  |  |  |  |
| Dec-12 | 7.6 |  |  |  |  |  |  |  |  |  |  |  |  |  |  |  |  |  |  |  |  |  |  |  |  |  |  |  |  |  |  |  |  |  |  |  |  |  |  |  |  |  |  |  |  |  |  |  |  |  |  |
| Jan-13 | 8.5 |  |  |  |  |  |  |  |  |  |  |  |  |  |  |  |  |  |  |  |  |  |  |  |  |  |  |  |  |  |  |  |  |  |  |  |  |  |  |  |  |  |  |  |  |  |  |  |  |  |  |
| Feb-13 | 8.1 |  |  |  |  |  |  |  |  |  |  |  |  |  |  |  |  |  |  |  |  |  |  |  |  |  |  |  |  |  |  |  |  |  |  |  |  |  |  |  |  |  |  |  |  |  |  |  |  |  |  |
| Mar-13 | 7.6 |  |  |  |  |  |  |  |  |  |  |  |  |  |  |  |  |  |  |  |  |  |  |  |  |  |  |  |  |  |  |  |  |  |  |  |  |  |  |  |  |  |  |  |  |  |  |  |  |  |  |
| Apr-13 | 7.1 |  |  |  |  |  |  |  |  |  |  |  |  |  |  |  |  |  |  |  |  |  |  |  |  |  |  |  |  |  |  |  |  |  |  |  |  |  |  |  |  |  |  |  |  |  |  |  |  |  |  |
| May-13 | 7.3 |  |  |  |  |  |  |  |  |  |  |  |  |  |  |  |  |  |  |  |  |  |  |  |  |  |  |  |  |  |  |  |  |  |  |  |  |  |  |  |  |  |  |  |  |  |  |  |  |  |  |
| Jun-13 | 7.8 |  |  |  |  |  |  |  |  |  |  |  |  |  |  |  |  |  |  |  |  |  |  |  |  |  |  |  |  |  |  |  |  |  |  |  |  |  |  |  |  |  |  |  |  |  |  |  |  |  |  |
| Jul-13 | 7.7 |  |  |  |  |  |  |  |  |  |  |  |  |  |  |  |  |  |  |  |  |  |  |  |  |  |  |  |  |  |  |  |  |  |  |  |  |  |  |  |  |  |  |  |  |  |  |  |  |  |  |
| Aug-13 | 7.3 |  |  |  |  |  |  |  |  |  |  |  |  |  |  |  |  |  |  |  |  |  |  |  |  |  |  |  |  |  |  |  |  |  |  |  |  |  |  |  |  |  |  |  |  |  |  |  |  |  |  |
| Sep-13 | 7 |  |  |  |  |  |  |  |  |  |  |  |  |  |  |  |  |  |  |  |  |  |  |  |  |  |  |  |  |  |  |  |  |  |  |  |  |  |  |  |  |  |  |  |  |  |  |  |  |  |  |
| Oct-13 | 7 |  |  |  |  |  |  |  |  |  |  |  |  |  |  |  |  |  |  |  |  |  |  |  |  |  |  |  |  |  |  |  |  |  |  |  |  |  |  |  |  |  |  |  |  |  |  |  |  |  |  |
| Nov-13 | 6.6 |  |  |  |  |  |  |  |  |  |  |  |  |  |  |  |  |  |  |  |  |  |  |  |  |  |  |  |  |  |  |  |  |  |  |  |  |  |  |  |  |  |  |  |  |  |  |  |  |  |  |
| Dec-13 | 6.5 |  |  |  |  |  |  |  |  |  |  |  |  |  |  |  |  |  |  |  |  |  |  |  |  |  |  |  |  |  |  |  |  |  |  |  |  |  |  |  |  |  |  |  |  |  |  |  |  |  |  |
| Jan-14 | 7 |  |  |  |  |  |  |  |  |  |  |  |  |  |  |  |  |  |  |  |  |  |  |  |  |  |  |  |  |  |  |  |  |  |  |  |  |  |  |  |  |  |  |  |  |  |  |  |  |  |  |
| Feb-14 | 7 |  |  |  |  |  |  |  |  |  |  |  |  |  |  |  |  |  |  |  |  |  |  |  |  |  |  |  |  |  |  |  |  |  |  |  |  |  |  |  |  |  |  |  |  |  |  |  |  |  |  |
| Mar-14 | 6.8 |  |  |  |  |  |  |  |  |  |  |  |  |  |  |  |  |  |  |  |  |  |  |  |  |  |  |  |  |  |  |  |  |  |  |  |  |  |  |  |  |  |  |  |  |  |  |  |  |  |  |
| Apr-14 | 5.9 |  |  |  |  |  |  |  |  |  |  |  |  |  |  |  |  |  |  |  |  |  |  |  |  |  |  |  |  |  |  |  |  |  |  |  |  |  |  |  |  |  |  |  |  |  |  |  |  |  |  |
| May-14 | 6.1 |  |  |  |  |  |  |  |  |  |  |  |  |  |  |  |  |  |  |  |  |  |  |  |  |  |  |  |  |  |  |  |  |  |  |  |  |  |  |  |  |  |  |  |  |  |  |  |  |  |  |
| Jun-14 | 6.3 |  |  |  |  |  |  |  |  |  |  |  |  |  |  |  |  |  |  |  |  |  |  |  |  |  |  |  |  |  |  |  |  |  |  |  |  |  |  |  |  |  |  |  |  |  |  |  |  |  |  |
| Jul-14 | 6.5 |  |  |  |  |  |  |  |  |  |  |  |  |  |  |  |  |  |  |  |  |  |  |  |  |  |  |  |  |  |  |  |  |  |  |  |  |  |  |  |  |  |  |  |  |  |  |  |  |  |  |
| Aug-14 | 6.3 |  |  |  |  |  |  |  |  |  |  |  |  |  |  |  |  |  |  |  |  |  |  |  |  |  |  |  |  |  |  |  |  |  |  |  |  |  |  |  |  |  |  |  |  |  |  |  |  |  |  |
| Sep-14 | 5.7 |  |  |  |  |  |  |  |  |  |  |  |  |  |  |  |  |  |  |  |  |  |  |  |  |  |  |  |  |  |  |  |  |  |  |  |  |  |  |  |  |  |  |  |  |  |  |  |  |  |  |
| Oct-14 | 5.5 |  |  |  |  |  |  |  |  |  |  |  |  |  |  |  |  |  |  |  |  |  |  |  |  |  |  |  |  |  |  |  |  |  |  |  |  |  |  |  |  |  |  |  |  |  |  |  |  |  |  |
| Nov-14 | 5.5 |  |  |  |  |  |  |  |  |  |  |  |  |  |  |  |  |  |  |  |  |  |  |  |  |  |  |  |  |  |  |  |  |  |  |  |  |  |  |  |  |  |  |  |  |  |  |  |  |  |  |
| Dec-14 | 5.4 |  |  |  |  |  |  |  |  |  |  |  |  |  |  |  |  |  |  |  |  |  |  |  |  |  |  |  |  |  |  |  |  |  |  |  |  |  |  |  |  |  |  |  |  |  |  |  |  |  |  |
| Jan-15 | 6.1 |  |  |  |  |  |  |  |  |  |  |  |  |  |  |  |  |  |  |  |  |  |  |  |  |  |  |  |  |  |  |  |  |  |  |  |  |  |  |  |  |  |  |  |  |  |  |  |  |  |  |
| Feb-15 | 5.8 |  |  |  |  |  |  |  |  |  |  |  |  |  |  |  |  |  |  |  |  |  |  |  |  |  |  |  |  |  |  |  |  |  |  |  |  |  |  |  |  |  |  |  |  |  |  |  |  |  |  |
| Mar-15 | 5.6 |  |  |  |  |  |  |  |  |  |  |  |  |  |  |  |  |  |  |  |  |  |  |  |  |  |  |  |  |  |  |  |  |  |  |  |  |  |  |  |  |  |  |  |  |  |  |  |  |  |  |
| Apr-15 | 5.1 |  |  |  |  |  |  |  |  |  |  |  |  |  |  |  |  |  |  |  |  |  |  |  |  |  |  |  |  |  |  |  |  |  |  |  |  |  |  |  |  |  |  |  |  |  |  |  |  |  |  |
| May-15 | 5.3 |  |  |  |  |  |  |  |  |  |  |  |  |  |  |  |  |  |  |  |  |  |  |  |  |  |  |  |  |  |  |  |  |  |  |  |  |  |  |  |  |  |  |  |  |  |  |  |  |  |  |
| Jun-15 | 5.5 |  |  |  |  |  |  |  |  |  |  |  |  |  |  |  |  |  |  |  |  |  |  |  |  |  |  |  |  |  |  |  |  |  |  |  |  |  |  |  |  |  |  |  |  |  |  |  |  |  |  |
| Jul-15 | 5.6 |  |  |  |  |  |  |  |  |  |  |  |  |  |  |  |  |  |  |  |  |  |  |  |  |  |  |  |  |  |  |  |  |  |  |  |  |  |  |  |  |  |  |  |  |  |  |  |  |  |  |
| Aug-15 | 5.2 |  |  |  |  |  |  |  |  |  |  |  |  |  |  |  |  |  |  |  |  |  |  |  |  |  |  |  |  |  |  |  |  |  |  |  |  |  |  |  |  |  |  |  |  |  |  |  |  |  |  |
| Sep-15 | 4.9 |  |  |  |  |  |  |  |  |  |  |  |  |  |  |  |  |  |  |  |  |  |  |  |  |  |  |  |  |  |  |  |  |  |  |  |  |  |  |  |  |  |  |  |  |  |  |  |  |  |  |
| Oct-15 | 4.8 |  |  |  |  |  |  |  |  |  |  |  |  |  |  |  |  |  |  |  |  |  |  |  |  |  |  |  |  |  |  |  |  |  |  |  |  |  |  |  |  |  |  |  |  |  |  |  |  |  |  |
| Nov-15 | 4.8 |  |  |  |  |  |  |  |  |  |  |  |  |  |  |  |  |  |  |  |  |  |  |  |  |  |  |  |  |  |  |  |  |  |  |  |  |  |  |  |  |  |  |  |  |  |  |  |  |  |  |
| Dec-15 | 4.8 |  |  |  |  |  |  |  |  |  |  |  |  |  |  |  |  |  |  |  |  |  |  |  |  |  |  |  |  |  |  |  |  |  |  |  |  |  |  |  |  |  |  |  |  |  |  |  |  |  |  |
| Jan-16 | 5.3 |  |  |  |  |  |  |  |  |  |  |  |  |  |  |  |  |  |  |  |  |  |  |  |  |  |  |  |  |  |  |  |  |  |  |  |  |  |  |  |  |  |  |  |  |  |  |  |  |  |  |
| Feb-16 | 5.2 |  |  |  |  |  |  |  |  |  |  |  |  |  |  |  |  |  |  |  |  |  |  |  |  |  |  |  |  |  |  |  |  |  |  |  |  |  |  |  |  |  |  |  |  |  |  |  |  |  |  |
| Mar-16 | 5.1 |  |  |  |  |  |  |  |  |  |  |  |  |  |  |  |  |  |  |  |  |  |  |  |  |  |  |  |  |  |  |  |  |  |  |  |  |  |  |  |  |  |  |  |  |  |  |  |  |  |  |
| Apr-16 | 4.7 |  |  |  |  |  |  |  |  |  |  |  |  |  |  |  |  |  |  |  |  |  |  |  |  |  |  |  |  |  |  |  |  |  |  |  |  |  |  |  |  |  |  |  |  |  |  |  |  |  |  |
| May-16 | 4.5 |  |  |  |  |  |  |  |  |  |  |  |  |  |  |  |  |  |  |  |  |  |  |  |  |  |  |  |  |  |  |  |  |  |  |  |  |  |  |  |  |  |  |  |  |  |  |  |  |  |  |
| Jun-16 | 5.1 |  |  |  |  |  |  |  |  |  |  |  |  |  |  |  |  |  |  |  |  |  |  |  |  |  |  |  |  |  |  |  |  |  |  |  |  |  |  |  |  |  |  |  |  |  |  |  |  |  |  |
| Jul-16 | 5.1 |  |  |  |  |  |  |  |  |  |  |  |  |  |  |  |  |  |  |  |  |  |  |  |  |  |  |  |  |  |  |  |  |  |  |  |  |  |  |  |  |  |  |  |  |  |  |  |  |  |  |
| Aug-16 | 5 |  |  |  |  |  |  |  |  |  |  |  |  |  |  |  |  |  |  |  |  |  |  |  |  |  |  |  |  |  |  |  |  |  |  |  |  |  |  |  |  |  |  |  |  |  |  |  |  |  |  |
| Sep-16 | 4.8 |  |  |  |  |  |  |  |  |  |  |  |  |  |  |  |  |  |  |  |  |  |  |  |  |  |  |  |  |  |  |  |  |  |  |  |  |  |  |  |  |  |  |  |  |  |  |  |  |  |  |
| Oct-16 | 4.7 |  |  |  |  |  |  |  |  |  |  |  |  |  |  |  |  |  |  |  |  |  |  |  |  |  |  |  |  |  |  |  |  |  |  |  |  |  |  |  |  |  |  |  |  |  |  |  |  |  |  |
| Nov-16 | 4.4 |  |  |  |  |  |  |  |  |  |  |  |  |  |  |  |  |  |  |  |  |  |  |  |  |  |  |  |  |  |  |  |  |  |  |  |  |  |  |  |  |  |  |  |  |  |  |  |  |  |  |
| Dec-16 | 4.5 |  |  |  |  |  |  |  |  |  |  |  |  |  |  |  |  |  |  |  |  |  |  |  |  |  |  |  |  |  |  |  |  |  |  |  |  |  |  |  |  |  |  |  |  |  |  |  |  |  |  |
| Jan-17 | 5.1 |  |  |  |  |  |  |  |  |  |  |  |  |  |  |  |  |  |  |  |  |  |  |  |  |  |  |  |  |  |  |  |  |  |  |  |  |  |  |  |  |  |  |  |  |  |  |  |  |  |  |
| Feb-17 | 4.9 |  |  |  |  |  |  |  |  |  |  |  |  |  |  |  |  |  |  |  |  |  |  |  |  |  |  |  |  |  |  |  |  |  |  |  |  |  |  |  |  |  |  |  |  |  |  |  |  |  |  |
| Mar-17 | 4.6 |  |  |  |  |  |  |  |  |  |  |  |  |  |  |  |  |  |  |  |  |  |  |  |  |  |  |  |  |  |  |  |  |  |  |  |  |  |  |  |  |  |  |  |  |  |  |  |  |  |  |
| Apr-17 | 4.1 |  |  |  |  |  |  |  |  |  |  |  |  |  |  |  |  |  |  |  |  |  |  |  |  |  |  |  |  |  |  |  |  |  |  |  |  |  |  |  |  |  |  |  |  |  |  |  |  |  |  |
| May-17 | 4.1 |  |  |  |  |  |  |  |  |  |  |  |  |  |  |  |  |  |  |  |  |  |  |  |  |  |  |  |  |  |  |  |  |  |  |  |  |  |  |  |  |  |  |  |  |  |  |  |  |  |  |
| Jun-17 | 4.5 |  |  |  |  |  |  |  |  |  |  |  |  |  |  |  |  |  |  |  |  |  |  |  |  |  |  |  |  |  |  |  |  |  |  |  |  |  |  |  |  |  |  |  |  |  |  |  |  |  |  |
| Jul-17 | 4.6 |  |  |  |  |  |  |  |  |  |  |  |  |  |  |  |  |  |  |  |  |  |  |  |  |  |  |  |  |  |  |  |  |  |  |  |  |  |  |  |  |  |  |  |  |  |  |  |  |  |  |
| Aug-17 | 4.5 |  |  |  |  |  |  |  |  |  |  |  |  |  |  |  |  |  |  |  |  |  |  |  |  |  |  |  |  |  |  |  |  |  |  |  |  |  |  |  |  |  |  |  |  |  |  |  |  |  |  |
| Sep-17 | 4.1 |  |  |  |  |  |  |  |  |  |  |  |  |  |  |  |  |  |  |  |  |  |  |  |  |  |  |  |  |  |  |  |  |  |  |  |  |  |  |  |  |  |  |  |  |  |  |  |  |  |  |
| Oct-17 | 3.9 |  |  |  |  |  |  |  |  |  |  |  |  |  |  |  |  |  |  |  |  |  |  |  |  |  |  |  |  |  |  |  |  |  |  |  |  |  |  |  |  |  |  |  |  |  |  |  |  |  |  |
| Nov-17 | 3.9 |  |  |  |  |  |  |  |  |  |  |  |  |  |  |  |  |  |  |  |  |  |  |  |  |  |  |  |  |  |  |  |  |  |  |  |  |  |  |  |  |  |  |  |  |  |  |  |  |  |  |
| Dec-17 | 3.9 |  |  |  |  |  |  |  |  |  |  |  |  |  |  |  |  |  |  |  |  |  |  |  |  |  |  |  |  |  |  |  |  |  |  |  |  |  |  |  |  |  |  |  |  |  |  |  |  |  |  |
| Jan-18 | 4.5 |  |  |  |  |  |  |  |  |  |  |  |  |  |  |  |  |  |  |  |  |  |  |  |  |  |  |  |  |  |  |  |  |  |  |  |  |  |  |  |  |  |  |  |  |  |  |  |  |  |  |
| Feb-18 | 4.4 |  |  |  |  |  |  |  |  |  |  |  |  |  |  |  |  |  |  |  |  |  |  |  |  |  |  |  |  |  |  |  |  |  |  |  |  |  |  |  |  |  |  |  |  |  |  |  |  |  |  |
| Mar-18 | 4.1 |  |  |  |  |  |  |  |  |  |  |  |  |  |  |  |  |  |  |  |  |  |  |  |  |  |  |  |  |  |  |  |  |  |  |  |  |  |  |  |  |  |  |  |  |  |  |  |  |  |  |
| Apr-18 | 3.7 |  |  |  |  |  |  |  |  |  |  |  |  |  |  |  |  |  |  |  |  |  |  |  |  |  |  |  |  |  |  |  |  |  |  |  |  |  |  |  |  |  |  |  |  |  |  |  |  |  |  |
| May-18 | 3.6 |  |  |  |  |  |  |  |  |  |  |  |  |  |  |  |  |  |  |  |  |  |  |  |  |  |  |  |  |  |  |  |  |  |  |  |  |  |  |  |  |  |  |  |  |  |  |  |  |  |  |
| Jun-18 | 4.2 |  |  |  |  |  |  |  |  |  |  |  |  |  |  |  |  |  |  |  |  |  |  |  |  |  |  |  |  |  |  |  |  |  |  |  |  |  |  |  |  |  |  |  |  |  |  |  |  |  |  |
| Jul-18 | 4.1 |  |  |  |  |  |  |  |  |  |  |  |  |  |  |  |  |  |  |  |  |  |  |  |  |  |  |  |  |  |  |  |  |  |  |  |  |  |  |  |  |  |  |  |  |  |  |  |  |  |  |
| Aug-18 | 3.9 |  |  |  |  |  |  |  |  |  |  |  |  |  |  |  |  |  |  |  |  |  |  |  |  |  |  |  |  |  |  |  |  |  |  |  |  |  |  |  |  |  |  |  |  |  |  |  |  |  |  |
| Sep-18 | 3.6 |  |  |  |  |  |  |  |  |  |  |  |  |  |  |  |  |  |  |  |  |  |  |  |  |  |  |  |  |  |  |  |  |  |  |  |  |  |  |  |  |  |  |  |  |  |  |  |  |  |  |
| Oct-18 | 3.5 |  |  |  |  |  |  |  |  |  |  |  |  |  |  |  |  |  |  |  |  |  |  |  |  |  |  |  |  |  |  |  |  |  |  |  |  |  |  |  |  |  |  |  |  |  |  |  |  |  |  |
| Nov-18 | 3.5 |  |  |  |  |  |  |  |  |  |  |  |  |  |  |  |  |  |  |  |  |  |  |  |  |  |  |  |  |  |  |  |  |  |  |  |  |  |  |  |  |  |  |  |  |  |  |  |  |  |  |
| Dec-18 | 3.7 |  |  |  |  |  |  |  |  |  |  |  |  |  |  |  |  |  |  |  |  |  |  |  |  |  |  |  |  |  |  |  |  |  |  |  |  |  |  |  |  |  |  |  |  |  |  |  |  |  |  |
| Jan-19 | 4.4 |  |  |  |  |  |  |  |  |  |  |  |  |  |  |  |  |  |  |  |  |  |  |  |  |  |  |  |  |  |  |  |  |  |  |  |  |  |  |  |  |  |  |  |  |  |  |  |  |  |  |
| Feb-19 | 4.1 |  |  |  |  |  |  |  |  |  |  |  |  |  |  |  |  |  |  |  |  |  |  |  |  |  |  |  |  |  |  |  |  |  |  |  |  |  |  |  |  |  |  |  |  |  |  |  |  |  |  |
| Mar-19 | 3.9 |  |  |  |  |  |  |  |  |  |  |  |  |  |  |  |  |  |  |  |  |  |  |  |  |  |  |  |  |  |  |  |  |  |  |  |  |  |  |  |  |  |  |  |  |  |  |  |  |  |  |
| Apr-19 | 3.3 |  |  |  |  |  |  |  |  |  |  |  |  |  |  |  |  |  |  |  |  |  |  |  |  |  |  |  |  |  |  |  |  |  |  |  |  |  |  |  |  |  |  |  |  |  |  |  |  |  |  |
| May-19 | 3.4 |  |  |  |  |  |  |  |  |  |  |  |  |  |  |  |  |  |  |  |  |  |  |  |  |  |  |  |  |  |  |  |  |  |  |  |  |  |  |  |  |  |  |  |  |  |  |  |  |  |  |
| Jun-19 | 3.8 |  |  |  |  |  |  |  |  |  |  |  |  |  |  |  |  |  |  |  |  |  |  |  |  |  |  |  |  |  |  |  |  |  |  |  |  |  |  |  |  |  |  |  |  |  |  |  |  |  |  |
| Jul-19 | 4 |  |  |  |  |  |  |  |  |  |  |  |  |  |  |  |  |  |  |  |  |  |  |  |  |  |  |  |  |  |  |  |  |  |  |  |  |  |  |  |  |  |  |  |  |  |  |  |  |  |  |
| Aug-19 | 3.8 |  |  |  |  |  |  |  |  |  |  |  |  |  |  |  |  |  |  |  |  |  |  |  |  |  |  |  |  |  |  |  |  |  |  |  |  |  |  |  |  |  |  |  |  |  |  |  |  |  |  |
| Sep-19 | 3.3 |  |  |  |  |  |  |  |  |  |  |  |  |  |  |  |  |  |  |  |  |  |  |  |  |  |  |  |  |  |  |  |  |  |  |  |  |  |  |  |  |  |  |  |  |  |  |  |  |  |  |
| Oct-19 | 3.3 |  |  |  |  |  |  |  |  |  |  |  |  |  |  |  |  |  |  |  |  |  |  |  |  |  |  |  |  |  |  |  |  |  |  |  |  |  |  |  |  |  |  |  |  |  |  |  |  |  |  |
| Nov-19 | 3.3 |  |  |  |  |  |  |  |  |  |  |  |  |  |  |  |  |  |  |  |  |  |  |  |  |  |  |  |  |  |  |  |  |  |  |  |  |  |  |  |  |  |  |  |  |  |  |  |  |  |  |
| Dec-19 | 3.4 |  |  |  |  |  |  |  |  |  |  |  |  |  |  |  |  |  |  |  |  |  |  |  |  |  |  |  |  |  |  |  |  |  |  |  |  |  |  |  |  |  |  |  |  |  |  |  |  |  |  |
| Jan-20 | 4 |  |  |  |  |  |  |  |  |  |  |  |  |  |  |  |  |  |  |  |  |  |  |  |  |  |  |  |  |  |  |  |  |  |  |  |  |  |  |  |  |  |  |  |  |  |  |  |  |  |  |
| Feb-20 | 3.8 |  |  |  |  |  |  |  |  |  |  |  |  |  |  |  |  |  |  |  |  |  |  |  |  |  |  |  |  |  |  |  |  |  |  |  |  |  |  |  |  |  |  |  |  |  |  |  |  |  |  |
| Mar-20 | 4.5 |  |  |  |  |  |  |  |  |  |  |  |  |  |  |  |  |  |  |  |  |  |  |  |  |  |  |  |  |  |  |  |  |  |  |  |  |  |  |  |  |  |  |  |  |  |  |  |  |  |  |
| Apr-20 | 14.4 |  |  |  |  |  |  |  |  |  |  |  |  |  |  |  |  |  |  |  |  |  |  |  |  |  |  |  |  |  |  |  |  |  |  |  |  |  |  |  |  |  |  |  |  |  |  |  |  |  |  |
| May-20 | 13 |  |  |  |  |  |  |  |  |  |  |  |  |  |  |  |  |  |  |  |  |  |  |  |  |  |  |  |  |  |  |  |  |  |  |  |  |  |  |  |  |  |  |  |  |  |  |  |  |  |  |
| Jun-20 | 11.2 |  |  |  |  |  |  |  |  |  |  |  |  |  |  |  |  |  |  |  |  |  |  |  |  |  |  |  |  |  |  |  |  |  |  |  |  |  |  |  |  |  |  |  |  |  |  |  |  |  |  |
| Jul-20 | 10.5 |  |  |  |  |  |  |  |  |  |  |  |  |  |  |  |  |  |  |  |  |  |  |  |  |  |  |  |  |  |  |  |  |  |  |  |  |  |  |  |  |  |  |  |  |  |  |  |  |  |  |
| Aug-20 | 8.5 |  |  |  |  |  |  |  |  |  |  |  |  |  |  |  |  |  |  |  |  |  |  |  |  |  |  |  |  |  |  |  |  |  |  |  |  |  |  |  |  |  |  |  |  |  |  |  |  |  |  |
| Sep-20 | 7.7 |  |  |  |  |  |  |  |  |  |  |  |  |  |  |  |  |  |  |  |  |  |  |  |  |  |  |  |  |  |  |  |  |  |  |  |  |  |  |  |  |  |  |  |  |  |  |  |  |  |  |
| Oct-20 | 6.6 |  |  |  |  |  |  |  |  |  |  |  |  |  |  |  |  |  |  |  |  |  |  |  |  |  |  |  |  |  |  |  |  |  |  |  |  |  |  |  |  |  |  |  |  |  |  |  |  |  |  |
| Nov-20 | 6.4 |  |  |  |  |  |  |  |  |  |  |  |  |  |  |  |  |  |  |  |  |  |  |  |  |  |  |  |  |  |  |  |  |  |  |  |  |  |  |  |  |  |  |  |  |  |  |  |  |  |  |
| Dec-20 | 6.5 |  |  |  |  |  |  |  |  |  |  |  |  |  |  |  |  |  |  |  |  |  |  |  |  |  |  |  |  |  |  |  |  |  |  |  |  |  |  |  |  |  |  |  |  |  |  |  |  |  |  |